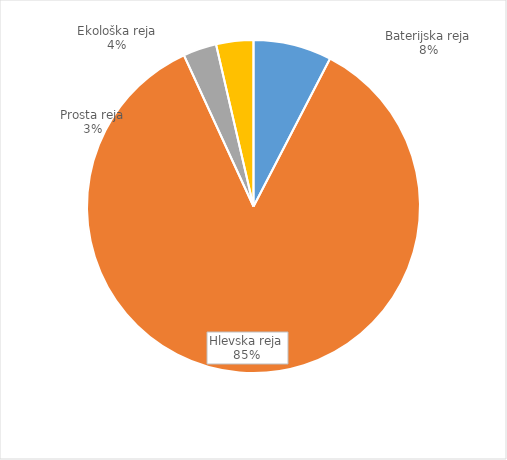
| Category | Količina kosov jajc |
|---|---|
| Baterijska reja | 248600 |
| Hlevska reja | 2797256 |
| Prosta reja | 106133 |
| Ekološka reja | 118240 |